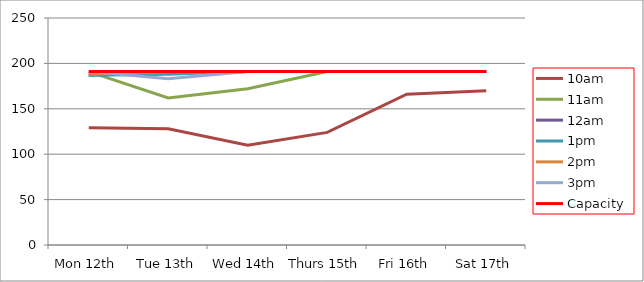
| Category | 9am | 10am | 11am | 12am | 1pm | 2pm | 3pm | 4pm | 5pm | Capacity |
|---|---|---|---|---|---|---|---|---|---|---|
| Mon 12th |  | 129 | 191 | 187 | 187 | 188 | 191 |  |  | 191 |
| Tue 13th |  | 128 | 162 | 191 | 188 | 191 | 183 |  |  | 191 |
| Wed 14th |  | 110 | 172 | 191 | 191 | 191 | 191 |  |  | 191 |
| Thurs 15th |  | 124 | 191 | 191 | 191 | 191 | 191 |  |  | 191 |
| Fri 16th |  | 166 | 191 | 191 | 191 | 191 | 191 |  |  | 191 |
| Sat 17th |  | 170 | 191 | 191 | 191 | 191 | 191 |  |  | 191 |